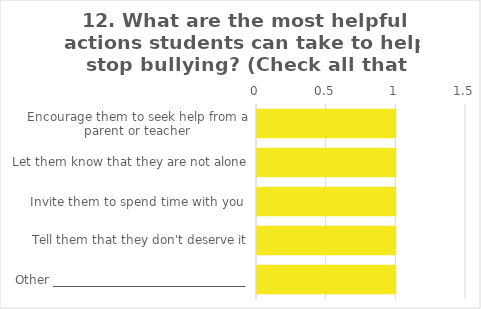
| Category | Field1 |
|---|---|
| Encourage them to seek help from a parent or teacher | 1 |
| Let them know that they are not alone | 1 |
| Invite them to spend time with you  | 1 |
| Tell them that they don't deserve it | 1 |
| Other ________________________________ | 1 |